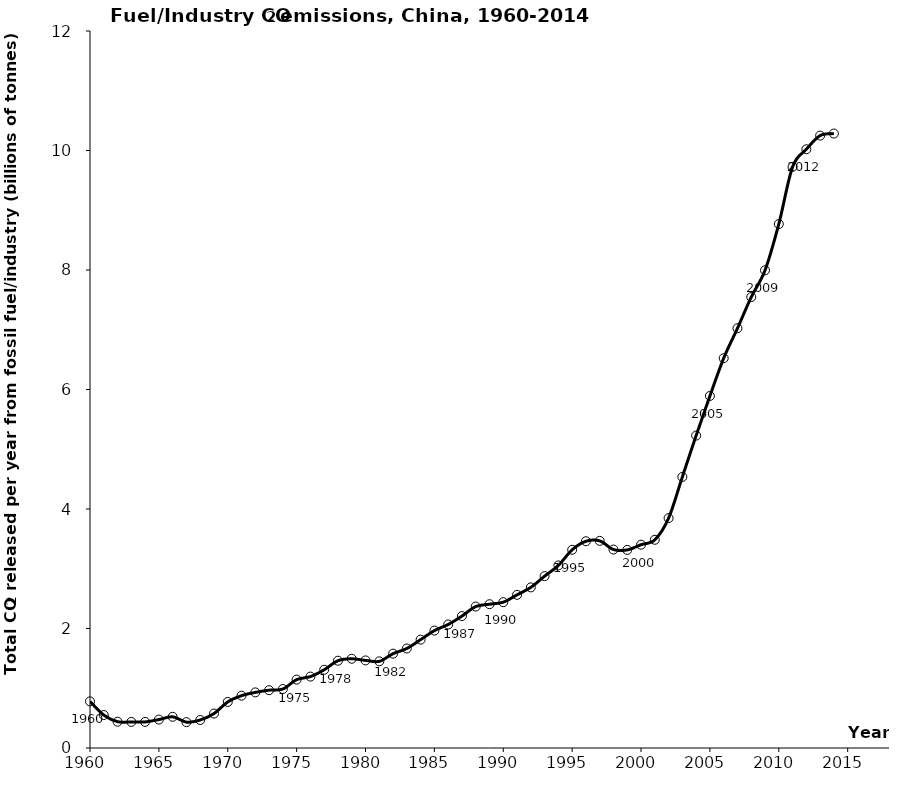
| Category | Series 0 |
|---|---|
| 1960.0 | 0.78 |
| 1961.0 | 0.552 |
| 1962.0 | 0.44 |
| 1963.0 | 0.436 |
| 1964.0 | 0.437 |
| 1965.0 | 0.476 |
| 1966.0 | 0.522 |
| 1967.0 | 0.433 |
| 1968.0 | 0.469 |
| 1969.0 | 0.577 |
| 1970.0 | 0.771 |
| 1971.0 | 0.876 |
| 1972.0 | 0.931 |
| 1973.0 | 0.968 |
| 1974.0 | 0.987 |
| 1975.0 | 1.145 |
| 1976.0 | 1.195 |
| 1977.0 | 1.309 |
| 1978.0 | 1.461 |
| 1979.0 | 1.494 |
| 1980.0 | 1.466 |
| 1981.0 | 1.45 |
| 1982.0 | 1.579 |
| 1983.0 | 1.666 |
| 1984.0 | 1.813 |
| 1985.0 | 1.965 |
| 1986.0 | 2.067 |
| 1987.0 | 2.208 |
| 1988.0 | 2.368 |
| 1989.0 | 2.407 |
| 1990.0 | 2.44 |
| 1991.0 | 2.563 |
| 1992.0 | 2.688 |
| 1993.0 | 2.876 |
| 1994.0 | 3.056 |
| 1995.0 | 3.318 |
| 1996.0 | 3.46 |
| 1997.0 | 3.467 |
| 1998.0 | 3.322 |
| 1999.0 | 3.315 |
| 2000.0 | 3.402 |
| 2001.0 | 3.485 |
| 2002.0 | 3.847 |
| 2003.0 | 4.537 |
| 2004.0 | 5.229 |
| 2005.0 | 5.892 |
| 2006.0 | 6.524 |
| 2007.0 | 7.025 |
| 2008.0 | 7.547 |
| 2009.0 | 7.994 |
| 2010.0 | 8.769 |
| 2011.0 | 9.726 |
| 2012.0 | 10.02 |
| 2013.0 | 10.25 |
| 2014.0 | 10.284 |